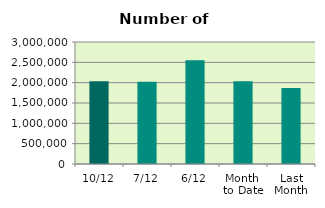
| Category | Series 0 |
|---|---|
| 10/12 | 2034428 |
| 7/12 | 2020544 |
| 6/12 | 2548794 |
| Month 
to Date | 2037312.667 |
| Last
Month | 1871523.909 |